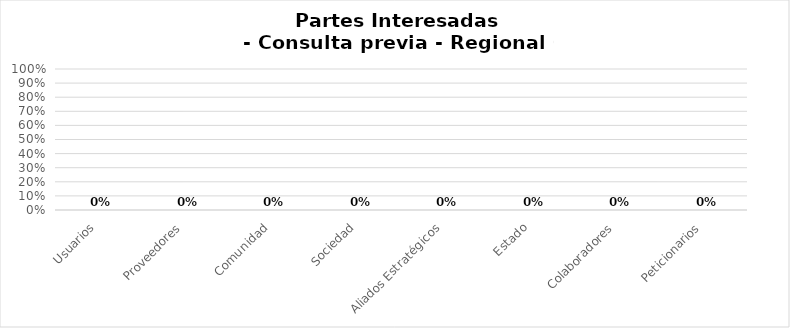
| Category | Tipo de organización - Consulta previa - Regional 0 / 0 |
|---|---|
| Usuarios | 0 |
| Proveedores | 0 |
| Comunidad | 0 |
| Sociedad | 0 |
| Aliados Estratégicos | 0 |
| Estado | 0 |
| Colaboradores | 0 |
| Peticionarios | 0 |